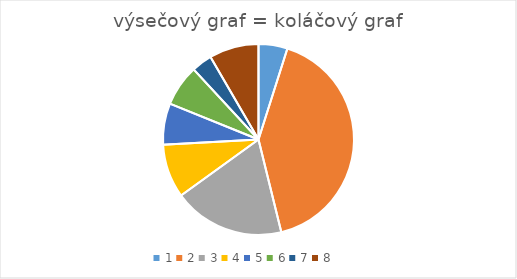
| Category | Series 0 |
|---|---|
| 1.0 | 7 |
| 2.0 | 59 |
| 3.0 | 27 |
| 4.0 | 13 |
| 5.0 | 10 |
| 6.0 | 10 |
| 7.0 | 5 |
| 8.0 | 12 |